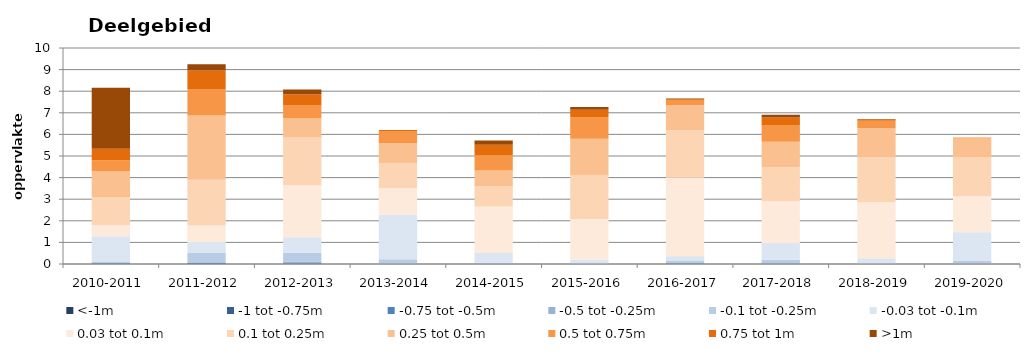
| Category | <-1m | -1 tot -0.75m | -0.75 tot -0.5m | -0.5 tot -0.25m | -0.1 tot -0.25m | -0.03 tot -0.1m | 0.03 tot 0.1m | 0.1 tot 0.25m | 0.25 tot 0.5m | 0.5 tot 0.75m | 0.75 tot 1m | >1m |
|---|---|---|---|---|---|---|---|---|---|---|---|---|
| 2010-2011 | 0 | 0.018 | 0.016 | 0.014 | 0.066 | 1.17 | 0.512 | 1.297 | 1.199 | 0.511 | 0.531 | 2.831 |
| 2011-2012 | 0.013 | 0.01 | 0.02 | 0.034 | 0.428 | 0.524 | 0.755 | 2.119 | 2.972 | 1.23 | 0.856 | 0.284 |
| 2012-2013 | 0.012 | 0.005 | 0.013 | 0.08 | 0.405 | 0.725 | 2.42 | 2.198 | 0.888 | 0.616 | 0.495 | 0.222 |
| 2013-2014 | 0 | 0 | 0 | 0.006 | 0.21 | 2.06 | 1.249 | 1.147 | 0.923 | 0.563 | 0.042 | 0 |
| 2014-2015 | 0 | 0 | 0 | 0.002 | 0.053 | 0.459 | 2.144 | 0.942 | 0.734 | 0.705 | 0.487 | 0.189 |
| 2015-2016 | 0 | 0 | 0.001 | 0.004 | 0.02 | 0.18 | 1.875 | 2.019 | 1.697 | 0.982 | 0.363 | 0.132 |
| 2016-2017 | 0.007 | 0.007 | 0.011 | 0.023 | 0.092 | 0.22 | 3.636 | 2.178 | 1.169 | 0.243 | 0.035 | 0.041 |
| 2017-2018 | 0 | 0.002 | 0.004 | 0.031 | 0.159 | 0.782 | 1.932 | 1.571 | 1.174 | 0.777 | 0.351 | 0.13 |
| 2018-2019 | 0 | 0 | 0 | 0.004 | 0.021 | 0.242 | 2.59 | 2.103 | 1.33 | 0.342 | 0.055 | 0.023 |
| 2019-2020 | 0 | 0 | 0.001 | 0.016 | 0.125 | 1.332 | 1.667 | 1.796 | 0.868 | 0.057 | 0 | 0 |